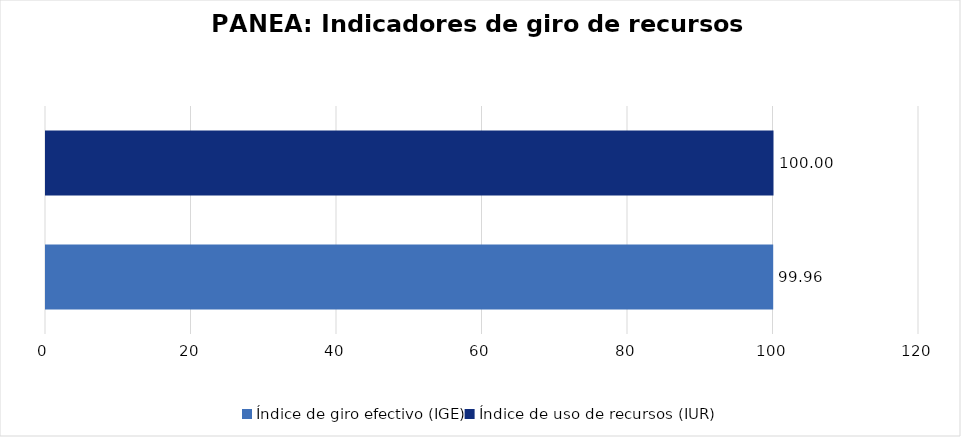
| Category | Series 0 |
|---|---|
| Índice de giro efectivo (IGE) | 99.959 |
| Índice de uso de recursos (IUR)  | 100 |